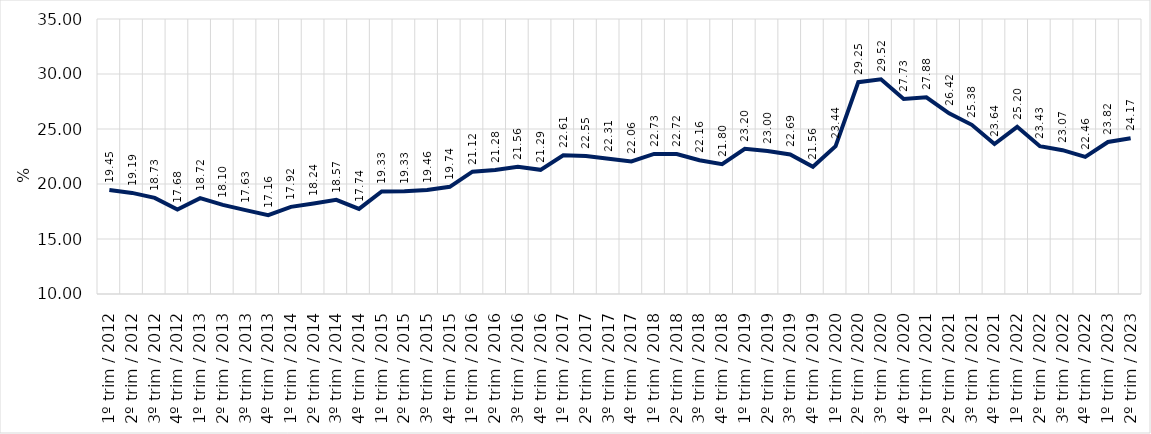
| Category | Series 0 |
|---|---|
| 1º trim / 2012 | 19.45 |
| 2º trim / 2012 | 19.19 |
| 3º trim / 2012 | 18.735 |
| 4º trim / 2012 | 17.678 |
| 1º trim / 2013 | 18.718 |
| 2º trim / 2013 | 18.103 |
| 3º trim / 2013 | 17.626 |
| 4º trim / 2013 | 17.163 |
| 1º trim / 2014 | 17.922 |
| 2º trim / 2014 | 18.235 |
| 3º trim / 2014 | 18.566 |
| 4º trim / 2014 | 17.737 |
| 1º trim / 2015 | 19.328 |
| 2º trim / 2015 | 19.335 |
| 3º trim / 2015 | 19.459 |
| 4º trim / 2015 | 19.744 |
| 1º trim / 2016 | 21.122 |
| 2º trim / 2016 | 21.28 |
| 3º trim / 2016 | 21.562 |
| 4º trim / 2016 | 21.286 |
| 1º trim / 2017 | 22.606 |
| 2º trim / 2017 | 22.55 |
| 3º trim / 2017 | 22.305 |
| 4º trim / 2017 | 22.056 |
| 1º trim / 2018 | 22.731 |
| 2º trim / 2018 | 22.719 |
| 3º trim / 2018 | 22.162 |
| 4º trim / 2018 | 21.803 |
| 1º trim / 2019 | 23.196 |
| 2º trim / 2019 | 23.004 |
| 3º trim / 2019 | 22.687 |
| 4º trim / 2019 | 21.563 |
| 1º trim / 2020 | 23.443 |
| 2º trim / 2020 | 29.255 |
| 3º trim / 2020 | 29.52 |
| 4º trim / 2020 | 27.732 |
| 1º trim / 2021 | 27.883 |
| 2º trim / 2021 | 26.425 |
| 3º trim / 2021 | 25.379 |
| 4º trim / 2021 | 23.635 |
| 1º trim / 2022 | 25.197 |
| 2º trim / 2022 | 23.432 |
| 3º trim / 2022 | 23.075 |
| 4º trim / 2022 | 22.464 |
| 1º trim / 2023 | 23.818 |
| 2º trim / 2023 | 24.166 |